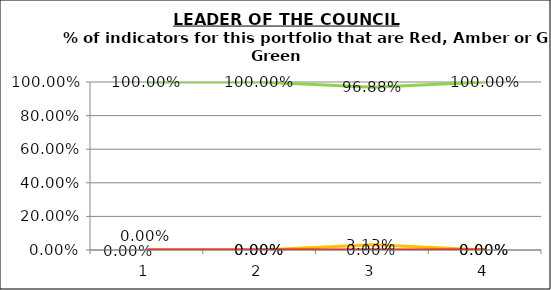
| Category | Green | Amber | Red |
|---|---|---|---|
| 0 | 1 | 0 | 0 |
| 1 | 1 | 0 | 0 |
| 2 | 0.969 | 0.031 | 0 |
| 3 | 1 | 0 | 0 |